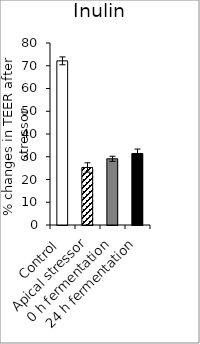
| Category | average |
|---|---|
| Control | 72.156 |
| Apical stressor | 25.294 |
| 0 h fermentation | 29.096 |
| 24 h fermentation | 31.438 |